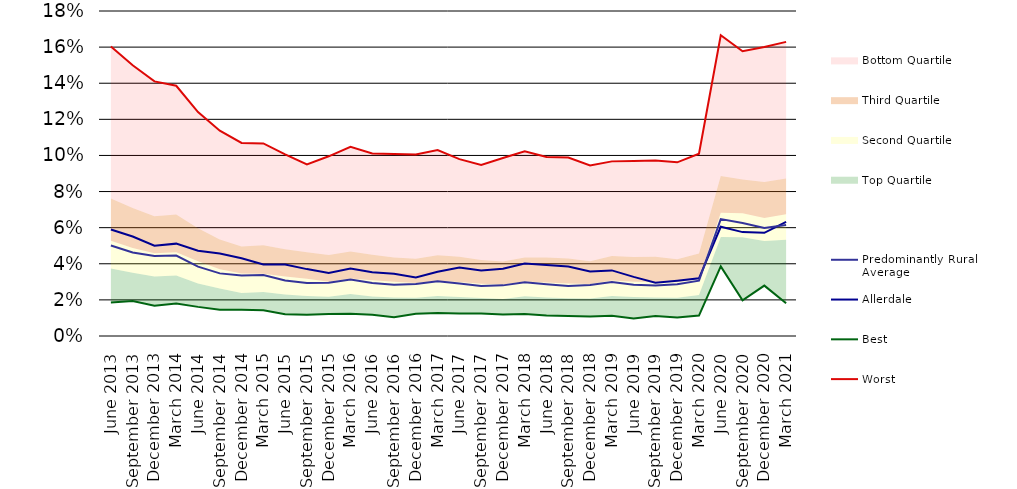
| Category | Worst | Best | Allerdale | Predominantly Rural Average |
|---|---|---|---|---|
| 0 | 0.16 | 0.019 | 0.059 | 0.05 |
| 1900-01-01 | 0.15 | 0.019 | 0.055 | 0.046 |
| 1900-01-02 | 0.141 | 0.017 | 0.05 | 0.044 |
| 1900-01-03 | 0.139 | 0.018 | 0.051 | 0.045 |
| 1900-01-04 | 0.124 | 0.016 | 0.047 | 0.038 |
| 1900-01-05 | 0.114 | 0.015 | 0.046 | 0.035 |
| 1900-01-06 | 0.107 | 0.015 | 0.043 | 0.033 |
| 1900-01-07 | 0.107 | 0.014 | 0.04 | 0.034 |
| 1900-01-08 | 0.101 | 0.012 | 0.04 | 0.031 |
| 1900-01-09 | 0.095 | 0.012 | 0.037 | 0.029 |
| 1900-01-10 | 0.1 | 0.012 | 0.035 | 0.03 |
| 1900-01-11 | 0.105 | 0.012 | 0.037 | 0.031 |
| 1900-01-12 | 0.101 | 0.012 | 0.035 | 0.029 |
| 1900-01-13 | 0.101 | 0.01 | 0.034 | 0.028 |
| 1900-01-14 | 0.101 | 0.012 | 0.032 | 0.029 |
| 1900-01-15 | 0.103 | 0.013 | 0.036 | 0.03 |
| 1900-01-16 | 0.098 | 0.013 | 0.038 | 0.029 |
| 1900-01-17 | 0.095 | 0.012 | 0.036 | 0.028 |
| 1900-01-18 | 0.099 | 0.012 | 0.037 | 0.028 |
| 1900-01-19 | 0.102 | 0.012 | 0.04 | 0.03 |
| 1900-01-20 | 0.099 | 0.011 | 0.039 | 0.029 |
| 1900-01-21 | 0.099 | 0.011 | 0.038 | 0.028 |
| 1900-01-22 | 0.094 | 0.011 | 0.036 | 0.028 |
| 1900-01-23 | 0.097 | 0.011 | 0.036 | 0.03 |
| 1900-01-24 | 0.097 | 0.01 | 0.033 | 0.028 |
| 1900-01-25 | 0.097 | 0.011 | 0.03 | 0.028 |
| 1900-01-26 | 0.096 | 0.01 | 0.031 | 0.029 |
| 1900-01-27 | 0.101 | 0.011 | 0.032 | 0.031 |
| 1900-01-28 | 0.167 | 0.039 | 0.061 | 0.065 |
| 1900-01-29 | 0.158 | 0.02 | 0.058 | 0.063 |
| 1900-01-30 | 0.16 | 0.028 | 0.057 | 0.06 |
| 1900-01-31 | 0.163 | 0.018 | 0.063 | 0.061 |